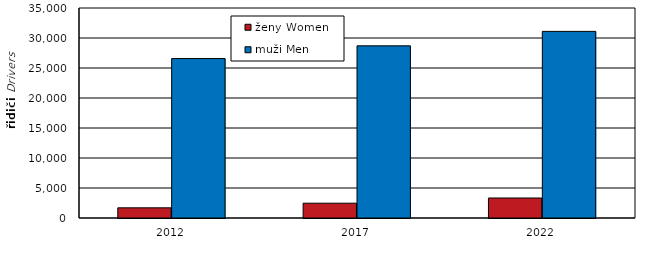
| Category | ženy | muži |
|---|---|---|
| 2012.0 | 1694 | 26574 |
| 2017.0 | 2467 | 28691 |
| 2022.0 | 3332 | 31102 |